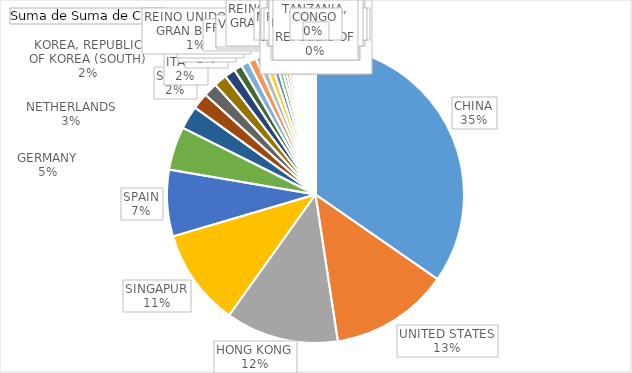
| Category | Total |
|---|---|
| CHINA | 4610252.85 |
| UNITED STATES | 1720869.46 |
| HONG KONG | 1635436.95 |
| SINGAPUR | 1406601.84 |
| SPAIN | 961991.21 |
| GERMANY | 629244.07 |
| NETHERLANDS | 335901.11 |
| SUIZA | 236358.03 |
| ITALIA | 198463.64 |
| KOREA, REPUBLIC OF KOREA (SOUTH) | 187334.79 |
| JAPAN | 158108.63 |
| BELGICA | 118481.23 |
| MALAYSIA | 116005.44 |
| REINO UNIDO DE GRAN BRETA | 112771.86 |
| FRANCE | 95790.85 |
| SUECIA | 90225.97 |
| VIETNAM | 77286.98 |
| BRAZIL | 67085.68 |
| CANADA | 47836 |
| ISRAEL | 46976.69 |
| AUSTRIA | 43744.19 |
| CHILE | 37719.27 |
| TAIWAN | 35805.27 |
| PANAMA | 31928.7 |
| PERU | 27652.86 |
| REINO UNIDO DE GRAN BRETAÃ‘A | 24820.69 |
| POLONIA | 20673.03 |
| RUSIA | 19521.74 |
| MEXICO | 19518.76 |
| COLOMBIA | 17617.37 |
| AUSTRALIA | 17158.76 |
| INDIA | 15777.21 |
| ARGENTINA | 13923.83 |
| UCRANIA | 12181.69 |
| MAURITIUS | 8040.12 |
| REPUBLICA DOMINICANA | 7065.23 |
| TAILANDIA | 7017.65 |
| LITUANIA | 5364.5 |
| REPUBLICA CHECA | 5240.15 |
| NORUEGA | 4977.85 |
| BOLIVIA | 4923.47 |
| PORTUGAL | 4851.85 |
| LETONIA | 4826.42 |
| COSTA RICA | 4596.5 |
| NUEVA ZELANDA | 4466.64 |
| DINAMARCA | 3179.29 |
| GRECIA | 3134.31 |
| TURQUIA | 2809.95 |
| FINLANDIA | 2568.94 |
| BULGARIA | 2425.28 |
| RUMANIA | 1962.94 |
| ESLOVAQUIA | 1897.9 |
| KUWAIT | 1847.62 |
| SWAZILAND | 1677.62 |
| URUGUAY | 1650.95 |
| CROACIA | 1530.02 |
| JERSEY | 1505.41 |
| EMIRATOS ARABES UNIDOS | 1479.31 |
| IRLANDA | 1400.33 |
| EL SALVADOR | 1299.61 |
| INDONESIA | 1287.87 |
| PARAGUAY | 1249.2 |
| CUBA | 1130.21 |
| HUNGRIA | 1091.35 |
| BIELORRUSIA | 1025.75 |
| LUXEMBURGO | 1002.4 |
| SUDAFRICA | 912.08 |
| CHIPRE | 868.77 |
| IRAN, ISLAMIC REPUBLIC OF | 800 |
| ESTONIA | 728.89 |
| FILIPINAS | 672.66 |
| TURKMENISTAN | 606.84 |
| ANTILLAS HOLANDESAS | 586.71 |
| ESLOVENIA | 581.34 |
| PAKISTAN | 554.77 |
| HONDURAS | 553.43 |
| DOMINICA | 526.69 |
| NICARAGUA | 512.94 |
| ARABIA SAUDITA | 464.59 |
| JAMAICA | 430.51 |
| ANGOLA | 421.19 |
| MACAO | 396.92 |
| NIGERIA | 354.82 |
| CURAZAO | 330.77 |
| ISLAS SALOMON | 300.44 |
| ESTADOS UNIDOS ISLAS MENORES | 291.48 |
| ALBANIA | 288.29 |
| ISLANDIA | 217.51 |
| GEORGIA | 203.9 |
| SERBIA | 194.24 |
| MACEDONIA, ANTIGUA REPUBLICA YUGOSLAVA DE | 176.01 |
| AZERBAIJAN | 167.79 |
| ARMENIA | 167.74 |
| REPUBLICA DE COREA, POPULAR DEMOCRATICA DE | 158.99 |
| ECUADOR | 153.51 |
| UZBEKISTAN | 148.72 |
| BONAIRE SAN EUSTAQUIO Y SABA | 133.03 |
| COTE DIVOIRE | 129.11 |
| GUINEA | 121.71 |
| CAMERUN | 116.01 |
| UGANDA | 93.99 |
| ISLAS HEARD Y MCDONALD | 93.09 |
| ARUBA | 88.98 |
| TUNISIA | 80.43 |
| JORDAN | 75.26 |
| NIGER | 73.18 |
| SRI LANKA | 67.47 |
| MARRUECOS | 63.84 |
| REPUBLICA ARABE SIRIA | 62.59 |
| ISLAS MARSHALL | 56.03 |
| GHANA | 53.04 |
| KENYA | 41.25 |
| SANTA LUCIA | 39.3 |
| TOGO | 35 |
| BANGLADESH | 34.41 |
| QATAR | 29.59 |
| EGYPT | 27.64 |
| NEPAL | 21.6 |
| KYRGYZSTAN | 17.62 |
| KAZAKHSTAN | 14.91 |
| ZIMBABWE | 12.2 |
| GAMBIA | 11.97 |
| CABO VERDE | 11.02 |
| BOSNIA Y HERZEGOVINA | 10.75 |
| FAROE ISLANDS | 10.6 |
| NUEVA CALEDONIA | 10.51 |
| MALTA | 7.83 |
| SURINAME | 7.02 |
| MALDIVAS | 6.98 |
| BELICE | 6.51 |
| SANTA SEDE (CIUDAD DEL VATICANO) | 6.47 |
| AFGANISTAN | 5.87 |
| MOLDOVA, REPUBLICA DE | 5.1 |
| MONGOLIA | 3.69 |
| LIBANO | 2.05 |
| BAHREIN | 1.16 |
| TONGA | 1.08 |
| TANZANIA, UNITED REPUBLIC OF | 1.05 |
| CONGO | 1.04 |
|  | 0 |